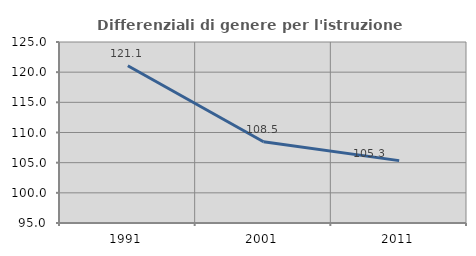
| Category | Differenziali di genere per l'istruzione superiore |
|---|---|
| 1991.0 | 121.069 |
| 2001.0 | 108.477 |
| 2011.0 | 105.34 |